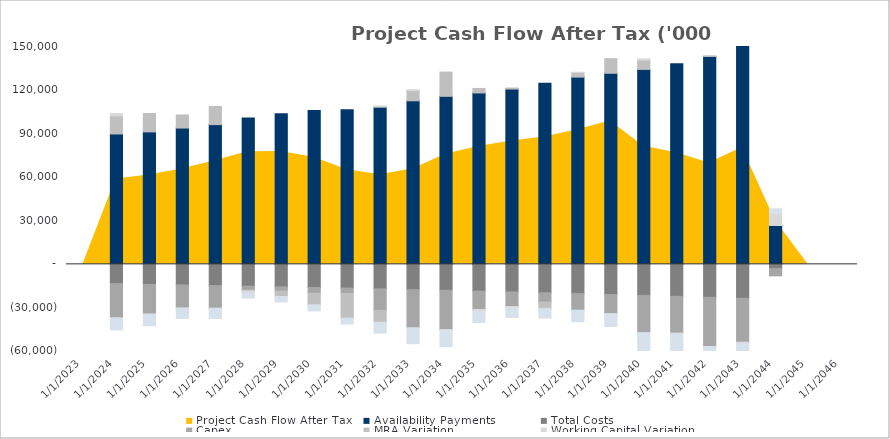
| Category | Availability Payments | Total Costs | Capex | MRA Variation | Working Capital Variation | Taxes |
|---|---|---|---|---|---|---|
| 12/31/23 | 0 | 0 | 0 | 0 | 0 | 0 |
| 12/31/24 | 89777.023 | -13254.862 | -23517.453 | 12400.21 | 1641.866 | -8342.863 |
| 12/31/25 | 91208.266 | -13798.498 | -20328.701 | 12643.237 | -346.946 | -7770.774 |
| 12/31/26 | 93840.677 | -14196.409 | -15712.583 | 9016.608 | -563.064 | -6742.123 |
| 12/31/27 | 96220.184 | -14607.405 | -15557.822 | 12463.823 | -174.516 | -6984.328 |
| 12/31/28 | 100841.872 | -15031.948 | -2713.015 | -653.603 | -1382.048 | -3478.783 |
| 12/31/29 | 103661.846 | -15470.517 | -2912.248 | -3701.507 | -198.017 | -3610.319 |
| 12/31/30 | 105871.469 | -15923.611 | -4037.72 | -8020.188 | -51.868 | -4014.868 |
| 12/31/31 | 106487.56 | -16391.744 | -3604.255 | -17115.812 | -47.788 | -3944.333 |
| 12/31/32 | 108241.626 | -16875.454 | -14775.324 | -8261.147 | 830.957 | -7440.282 |
| 12/31/33 | 112604.806 | -17375.297 | -26247.8 | 7049.097 | 608.209 | -10966.107 |
| 12/31/34 | 115687.407 | -17891.851 | -27081.822 | 16695.309 | -142.358 | -11531.044 |
| 12/31/35 | 118027.62 | -18425.715 | -12568.463 | 3095.957 | -1341.346 | -7688.995 |
| 12/31/36 | 120699.994 | -18977.514 | -10062.708 | 723.457 | -359.662 | -7152.73 |
| 12/31/37 | 124745.656 | -19547.894 | -6346.416 | -4273.046 | -611.672 | -6221.523 |
| 12/31/38 | 128914.055 | -20137.528 | -11418.189 | 3196.327 | 122.713 | -7953.287 |
| 12/31/39 | 131556.609 | -20747.115 | -13245.98 | 10048.237 | -16.864 | -8830.504 |
| 12/31/40 | 134233.22 | -21377.379 | -25581.95 | 6395.488 | 865.321 | -12994.106 |
| 12/31/41 | 138134.841 | -22029.075 | -25295.203 | 0 | -310.284 | -13591.281 |
| 12/31/42 | 143224.425 | -22702.985 | -33842.453 | 0 | 339.582 | -17237.049 |
| 12/31/43 | 154219.436 | -23399.925 | -30172.401 | 0 | -1148.065 | -19111.97 |
| 12/31/44 | 26775.523 | -2893.546 | -5021.072 | 0 | 8272.365 | 3246.567 |
| 12/31/45 | 0 | 0 | 0 | 0 | 0 | 0 |
| 12/31/46 | 0 | 0 | 0 | 0 | 0 | 0 |
| 12/31/47 | 0 | 0 | 0 | 0 | 0 | 0 |
| 12/31/48 | 0 | 0 | 0 | 0 | 0 | 0 |
| 12/31/49 | 0 | 0 | 0 | 0 | 0 | 0 |
| 12/31/50 | 0 | 0 | 0 | 0 | 0 | 0 |